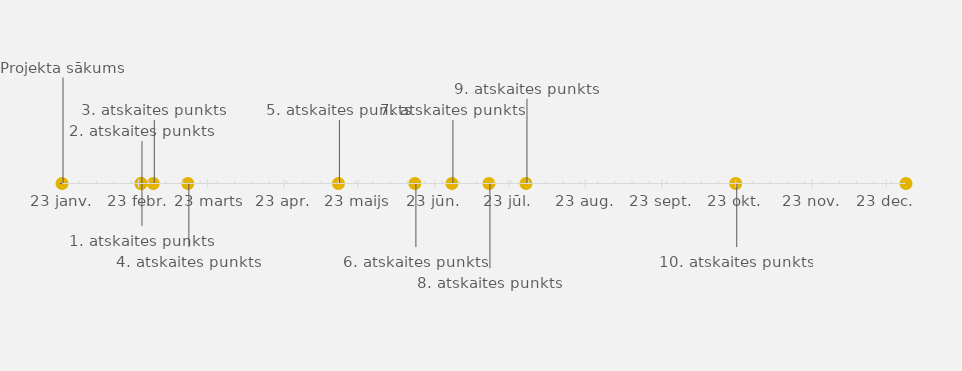
| Category | POZĪCIJA |
|---|---|
| Projekta sākums | 25 |
| 1. atskaites punkts | -10 |
| 2. atskaites punkts | 10 |
| 3. atskaites punkts | 15 |
| 4. atskaites punkts | -15 |
| 5. atskaites punkts | 15 |
| 6. atskaites punkts | -15 |
| 7. atskaites punkts | 15 |
| 8. atskaites punkts | -20 |
| 9. atskaites punkts | 20 |
| 10. atskaites punkts | -15 |
| Projekta beigas | 15 |